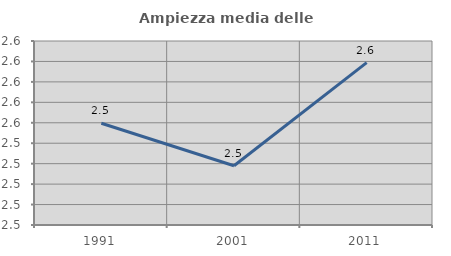
| Category | Ampiezza media delle famiglie |
|---|---|
| 1991.0 | 2.55 |
| 2001.0 | 2.508 |
| 2011.0 | 2.609 |